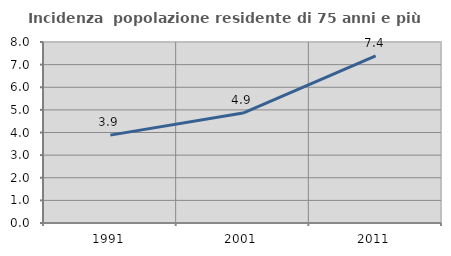
| Category | Incidenza  popolazione residente di 75 anni e più |
|---|---|
| 1991.0 | 3.884 |
| 2001.0 | 4.858 |
| 2011.0 | 7.382 |